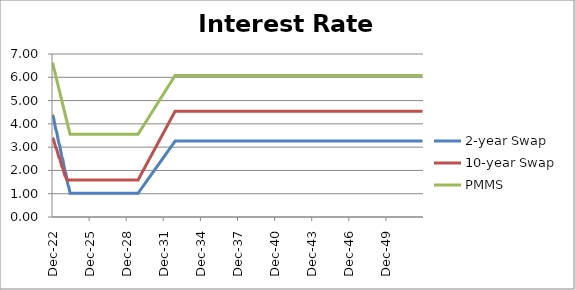
| Category | 2-year Swap | 10-year Swap | PMMS |
|---|---|---|---|
| 2022-12-30 | 4.388 | 3.404 | 6.629 |
| 2023-01-31 | 4.268 | 3.322 | 6.448 |
| 2023-02-28 | 4.027 | 3.16 | 6.267 |
| 2023-03-31 | 3.787 | 2.997 | 6.086 |
| 2023-04-30 | 3.667 | 2.916 | 5.905 |
| 2023-05-31 | 3.426 | 2.753 | 5.724 |
| 2023-06-30 | 3.186 | 2.59 | 5.543 |
| 2023-07-31 | 3.065 | 2.509 | 5.362 |
| 2023-08-31 | 2.825 | 2.346 | 5.181 |
| 2023-09-30 | 2.584 | 2.184 | 5.001 |
| 2023-10-31 | 2.464 | 2.102 | 4.82 |
| 2023-11-30 | 2.223 | 1.94 | 4.639 |
| 2023-12-31 | 1.983 | 1.777 | 4.458 |
| 2024-01-31 | 1.863 | 1.696 | 4.277 |
| 2024-02-29 | 1.622 | 1.589 | 4.096 |
| 2024-03-31 | 1.381 | 1.589 | 3.915 |
| 2024-04-30 | 1.261 | 1.589 | 3.734 |
| 2024-05-31 | 1.021 | 1.589 | 3.553 |
| 2024-06-30 | 1.021 | 1.589 | 3.553 |
| 2024-07-31 | 1.021 | 1.589 | 3.553 |
| 2024-08-31 | 1.021 | 1.589 | 3.553 |
| 2024-09-30 | 1.021 | 1.589 | 3.553 |
| 2024-10-31 | 1.021 | 1.589 | 3.553 |
| 2024-11-30 | 1.021 | 1.589 | 3.553 |
| 2024-12-31 | 1.021 | 1.589 | 3.553 |
| 2025-01-31 | 1.021 | 1.589 | 3.553 |
| 2025-02-28 | 1.021 | 1.589 | 3.553 |
| 2025-03-31 | 1.021 | 1.589 | 3.553 |
| 2025-04-30 | 1.021 | 1.589 | 3.553 |
| 2025-05-31 | 1.021 | 1.589 | 3.553 |
| 2025-06-30 | 1.021 | 1.589 | 3.553 |
| 2025-07-31 | 1.021 | 1.589 | 3.553 |
| 2025-08-31 | 1.021 | 1.589 | 3.553 |
| 2025-09-30 | 1.021 | 1.589 | 3.553 |
| 2025-10-31 | 1.021 | 1.589 | 3.553 |
| 2025-11-30 | 1.021 | 1.589 | 3.553 |
| 2025-12-31 | 1.021 | 1.589 | 3.553 |
| 2026-01-31 | 1.021 | 1.589 | 3.553 |
| 2026-02-28 | 1.021 | 1.589 | 3.553 |
| 2026-03-31 | 1.021 | 1.589 | 3.553 |
| 2026-04-30 | 1.021 | 1.589 | 3.553 |
| 2026-05-31 | 1.021 | 1.589 | 3.553 |
| 2026-06-30 | 1.021 | 1.589 | 3.553 |
| 2026-07-31 | 1.021 | 1.589 | 3.553 |
| 2026-08-31 | 1.021 | 1.589 | 3.553 |
| 2026-09-30 | 1.021 | 1.589 | 3.553 |
| 2026-10-31 | 1.021 | 1.589 | 3.553 |
| 2026-11-30 | 1.021 | 1.589 | 3.553 |
| 2026-12-31 | 1.021 | 1.589 | 3.553 |
| 2027-01-31 | 1.021 | 1.589 | 3.553 |
| 2027-02-28 | 1.021 | 1.589 | 3.553 |
| 2027-03-31 | 1.021 | 1.589 | 3.553 |
| 2027-04-30 | 1.021 | 1.589 | 3.553 |
| 2027-05-31 | 1.021 | 1.589 | 3.553 |
| 2027-06-30 | 1.021 | 1.589 | 3.553 |
| 2027-07-31 | 1.021 | 1.589 | 3.553 |
| 2027-08-31 | 1.021 | 1.589 | 3.553 |
| 2027-09-30 | 1.021 | 1.589 | 3.553 |
| 2027-10-31 | 1.021 | 1.589 | 3.553 |
| 2027-11-30 | 1.021 | 1.589 | 3.553 |
| 2027-12-31 | 1.021 | 1.589 | 3.553 |
| 2028-01-31 | 1.021 | 1.589 | 3.553 |
| 2028-02-29 | 1.021 | 1.589 | 3.553 |
| 2028-03-31 | 1.021 | 1.589 | 3.553 |
| 2028-04-30 | 1.021 | 1.589 | 3.553 |
| 2028-05-31 | 1.021 | 1.589 | 3.553 |
| 2028-06-30 | 1.021 | 1.589 | 3.553 |
| 2028-07-31 | 1.021 | 1.589 | 3.553 |
| 2028-08-31 | 1.021 | 1.589 | 3.553 |
| 2028-09-30 | 1.021 | 1.589 | 3.553 |
| 2028-10-31 | 1.021 | 1.589 | 3.553 |
| 2028-11-30 | 1.021 | 1.589 | 3.553 |
| 2028-12-31 | 1.021 | 1.589 | 3.553 |
| 2029-01-31 | 1.021 | 1.589 | 3.553 |
| 2029-02-28 | 1.021 | 1.589 | 3.553 |
| 2029-03-31 | 1.021 | 1.589 | 3.553 |
| 2029-04-30 | 1.021 | 1.589 | 3.553 |
| 2029-05-31 | 1.021 | 1.589 | 3.553 |
| 2029-06-30 | 1.021 | 1.589 | 3.553 |
| 2029-07-31 | 1.021 | 1.589 | 3.553 |
| 2029-08-31 | 1.021 | 1.589 | 3.553 |
| 2029-09-30 | 1.021 | 1.589 | 3.553 |
| 2029-10-31 | 1.021 | 1.589 | 3.553 |
| 2029-11-30 | 1.021 | 1.589 | 3.553 |
| 2029-12-31 | 1.083 | 1.671 | 3.623 |
| 2030-01-31 | 1.145 | 1.753 | 3.693 |
| 2030-02-28 | 1.207 | 1.835 | 3.763 |
| 2030-03-31 | 1.269 | 1.918 | 3.834 |
| 2030-04-30 | 1.332 | 2 | 3.904 |
| 2030-05-31 | 1.394 | 2.082 | 3.974 |
| 2030-06-30 | 1.456 | 2.164 | 4.044 |
| 2030-07-31 | 1.518 | 2.246 | 4.114 |
| 2030-08-31 | 1.58 | 2.328 | 4.185 |
| 2030-09-30 | 1.642 | 2.41 | 4.255 |
| 2030-10-31 | 1.705 | 2.493 | 4.325 |
| 2030-11-30 | 1.767 | 2.575 | 4.395 |
| 2030-12-31 | 1.829 | 2.657 | 4.465 |
| 2031-01-31 | 1.891 | 2.739 | 4.535 |
| 2031-02-28 | 1.953 | 2.821 | 4.606 |
| 2031-03-31 | 2.016 | 2.903 | 4.676 |
| 2031-04-30 | 2.078 | 2.985 | 4.746 |
| 2031-05-31 | 2.14 | 3.067 | 4.816 |
| 2031-06-30 | 2.202 | 3.15 | 4.886 |
| 2031-07-31 | 2.264 | 3.232 | 4.956 |
| 2031-08-31 | 2.327 | 3.314 | 5.027 |
| 2031-09-30 | 2.389 | 3.396 | 5.097 |
| 2031-10-31 | 2.451 | 3.478 | 5.167 |
| 2031-11-30 | 2.513 | 3.56 | 5.237 |
| 2031-12-31 | 2.575 | 3.642 | 5.307 |
| 2032-01-31 | 2.637 | 3.725 | 5.377 |
| 2032-02-29 | 2.7 | 3.807 | 5.448 |
| 2032-03-31 | 2.762 | 3.889 | 5.518 |
| 2032-04-30 | 2.824 | 3.971 | 5.588 |
| 2032-05-31 | 2.886 | 4.053 | 5.658 |
| 2032-06-30 | 2.948 | 4.135 | 5.728 |
| 2032-07-31 | 3.011 | 4.217 | 5.798 |
| 2032-08-31 | 3.073 | 4.3 | 5.869 |
| 2032-09-30 | 3.135 | 4.382 | 5.939 |
| 2032-10-31 | 3.197 | 4.464 | 6.009 |
| 2032-11-30 | 3.259 | 4.546 | 6.079 |
| 2032-12-31 | 3.259 | 4.546 | 6.079 |
| 2033-01-31 | 3.259 | 4.546 | 6.079 |
| 2033-02-28 | 3.259 | 4.546 | 6.079 |
| 2033-03-31 | 3.259 | 4.546 | 6.079 |
| 2033-04-30 | 3.259 | 4.546 | 6.079 |
| 2033-05-31 | 3.259 | 4.546 | 6.079 |
| 2033-06-30 | 3.259 | 4.546 | 6.079 |
| 2033-07-31 | 3.259 | 4.546 | 6.079 |
| 2033-08-31 | 3.259 | 4.546 | 6.079 |
| 2033-09-30 | 3.259 | 4.546 | 6.079 |
| 2033-10-31 | 3.259 | 4.546 | 6.079 |
| 2033-11-30 | 3.259 | 4.546 | 6.079 |
| 2033-12-31 | 3.259 | 4.546 | 6.079 |
| 2034-01-31 | 3.259 | 4.546 | 6.079 |
| 2034-02-28 | 3.259 | 4.546 | 6.079 |
| 2034-03-31 | 3.259 | 4.546 | 6.079 |
| 2034-04-30 | 3.259 | 4.546 | 6.079 |
| 2034-05-31 | 3.259 | 4.546 | 6.079 |
| 2034-06-30 | 3.259 | 4.546 | 6.079 |
| 2034-07-31 | 3.259 | 4.546 | 6.079 |
| 2034-08-31 | 3.259 | 4.546 | 6.079 |
| 2034-09-30 | 3.259 | 4.546 | 6.079 |
| 2034-10-31 | 3.259 | 4.546 | 6.079 |
| 2034-11-30 | 3.259 | 4.546 | 6.079 |
| 2034-12-31 | 3.259 | 4.546 | 6.079 |
| 2035-01-31 | 3.259 | 4.546 | 6.079 |
| 2035-02-28 | 3.259 | 4.546 | 6.079 |
| 2035-03-31 | 3.259 | 4.546 | 6.079 |
| 2035-04-30 | 3.259 | 4.546 | 6.079 |
| 2035-05-31 | 3.259 | 4.546 | 6.079 |
| 2035-06-30 | 3.259 | 4.546 | 6.079 |
| 2035-07-31 | 3.259 | 4.546 | 6.079 |
| 2035-08-31 | 3.259 | 4.546 | 6.079 |
| 2035-09-30 | 3.259 | 4.546 | 6.079 |
| 2035-10-31 | 3.259 | 4.546 | 6.079 |
| 2035-11-30 | 3.259 | 4.546 | 6.079 |
| 2035-12-31 | 3.259 | 4.546 | 6.079 |
| 2036-01-31 | 3.259 | 4.546 | 6.079 |
| 2036-02-29 | 3.259 | 4.546 | 6.079 |
| 2036-03-31 | 3.259 | 4.546 | 6.079 |
| 2036-04-30 | 3.259 | 4.546 | 6.079 |
| 2036-05-31 | 3.259 | 4.546 | 6.079 |
| 2036-06-30 | 3.259 | 4.546 | 6.079 |
| 2036-07-31 | 3.259 | 4.546 | 6.079 |
| 2036-08-31 | 3.259 | 4.546 | 6.079 |
| 2036-09-30 | 3.259 | 4.546 | 6.079 |
| 2036-10-31 | 3.259 | 4.546 | 6.079 |
| 2036-11-30 | 3.259 | 4.546 | 6.079 |
| 2036-12-31 | 3.259 | 4.546 | 6.079 |
| 2037-01-31 | 3.259 | 4.546 | 6.079 |
| 2037-02-28 | 3.259 | 4.546 | 6.079 |
| 2037-03-31 | 3.259 | 4.546 | 6.079 |
| 2037-04-30 | 3.259 | 4.546 | 6.079 |
| 2037-05-31 | 3.259 | 4.546 | 6.079 |
| 2037-06-30 | 3.259 | 4.546 | 6.079 |
| 2037-07-31 | 3.259 | 4.546 | 6.079 |
| 2037-08-31 | 3.259 | 4.546 | 6.079 |
| 2037-09-30 | 3.259 | 4.546 | 6.079 |
| 2037-10-31 | 3.259 | 4.546 | 6.079 |
| 2037-11-30 | 3.259 | 4.546 | 6.079 |
| 2037-12-31 | 3.259 | 4.546 | 6.079 |
| 2038-01-31 | 3.259 | 4.546 | 6.079 |
| 2038-02-28 | 3.259 | 4.546 | 6.079 |
| 2038-03-31 | 3.259 | 4.546 | 6.079 |
| 2038-04-30 | 3.259 | 4.546 | 6.079 |
| 2038-05-31 | 3.259 | 4.546 | 6.079 |
| 2038-06-30 | 3.259 | 4.546 | 6.079 |
| 2038-07-31 | 3.259 | 4.546 | 6.079 |
| 2038-08-31 | 3.259 | 4.546 | 6.079 |
| 2038-09-30 | 3.259 | 4.546 | 6.079 |
| 2038-10-31 | 3.259 | 4.546 | 6.079 |
| 2038-11-30 | 3.259 | 4.546 | 6.079 |
| 2038-12-31 | 3.259 | 4.546 | 6.079 |
| 2039-01-31 | 3.259 | 4.546 | 6.079 |
| 2039-02-28 | 3.259 | 4.546 | 6.079 |
| 2039-03-31 | 3.259 | 4.546 | 6.079 |
| 2039-04-30 | 3.259 | 4.546 | 6.079 |
| 2039-05-31 | 3.259 | 4.546 | 6.079 |
| 2039-06-30 | 3.259 | 4.546 | 6.079 |
| 2039-07-31 | 3.259 | 4.546 | 6.079 |
| 2039-08-31 | 3.259 | 4.546 | 6.079 |
| 2039-09-30 | 3.259 | 4.546 | 6.079 |
| 2039-10-31 | 3.259 | 4.546 | 6.079 |
| 2039-11-30 | 3.259 | 4.546 | 6.079 |
| 2039-12-31 | 3.259 | 4.546 | 6.079 |
| 2040-01-31 | 3.259 | 4.546 | 6.079 |
| 2040-02-29 | 3.259 | 4.546 | 6.079 |
| 2040-03-31 | 3.259 | 4.546 | 6.079 |
| 2040-04-30 | 3.259 | 4.546 | 6.079 |
| 2040-05-31 | 3.259 | 4.546 | 6.079 |
| 2040-06-30 | 3.259 | 4.546 | 6.079 |
| 2040-07-31 | 3.259 | 4.546 | 6.079 |
| 2040-08-31 | 3.259 | 4.546 | 6.079 |
| 2040-09-30 | 3.259 | 4.546 | 6.079 |
| 2040-10-31 | 3.259 | 4.546 | 6.079 |
| 2040-11-30 | 3.259 | 4.546 | 6.079 |
| 2040-12-31 | 3.259 | 4.546 | 6.079 |
| 2041-01-31 | 3.259 | 4.546 | 6.079 |
| 2041-02-28 | 3.259 | 4.546 | 6.079 |
| 2041-03-31 | 3.259 | 4.546 | 6.079 |
| 2041-04-30 | 3.259 | 4.546 | 6.079 |
| 2041-05-31 | 3.259 | 4.546 | 6.079 |
| 2041-06-30 | 3.259 | 4.546 | 6.079 |
| 2041-07-31 | 3.259 | 4.546 | 6.079 |
| 2041-08-31 | 3.259 | 4.546 | 6.079 |
| 2041-09-30 | 3.259 | 4.546 | 6.079 |
| 2041-10-31 | 3.259 | 4.546 | 6.079 |
| 2041-11-30 | 3.259 | 4.546 | 6.079 |
| 2041-12-31 | 3.259 | 4.546 | 6.079 |
| 2042-01-31 | 3.259 | 4.546 | 6.079 |
| 2042-02-28 | 3.259 | 4.546 | 6.079 |
| 2042-03-31 | 3.259 | 4.546 | 6.079 |
| 2042-04-30 | 3.259 | 4.546 | 6.079 |
| 2042-05-31 | 3.259 | 4.546 | 6.079 |
| 2042-06-30 | 3.259 | 4.546 | 6.079 |
| 2042-07-31 | 3.259 | 4.546 | 6.079 |
| 2042-08-31 | 3.259 | 4.546 | 6.079 |
| 2042-09-30 | 3.259 | 4.546 | 6.079 |
| 2042-10-31 | 3.259 | 4.546 | 6.079 |
| 2042-11-30 | 3.259 | 4.546 | 6.079 |
| 2042-12-31 | 3.259 | 4.546 | 6.079 |
| 2043-01-31 | 3.259 | 4.546 | 6.079 |
| 2043-02-28 | 3.259 | 4.546 | 6.079 |
| 2043-03-31 | 3.259 | 4.546 | 6.079 |
| 2043-04-30 | 3.259 | 4.546 | 6.079 |
| 2043-05-31 | 3.259 | 4.546 | 6.079 |
| 2043-06-30 | 3.259 | 4.546 | 6.079 |
| 2043-07-31 | 3.259 | 4.546 | 6.079 |
| 2043-08-31 | 3.259 | 4.546 | 6.079 |
| 2043-09-30 | 3.259 | 4.546 | 6.079 |
| 2043-10-31 | 3.259 | 4.546 | 6.079 |
| 2043-11-30 | 3.259 | 4.546 | 6.079 |
| 2043-12-31 | 3.259 | 4.546 | 6.079 |
| 2044-01-31 | 3.259 | 4.546 | 6.079 |
| 2044-02-29 | 3.259 | 4.546 | 6.079 |
| 2044-03-31 | 3.259 | 4.546 | 6.079 |
| 2044-04-30 | 3.259 | 4.546 | 6.079 |
| 2044-05-31 | 3.259 | 4.546 | 6.079 |
| 2044-06-30 | 3.259 | 4.546 | 6.079 |
| 2044-07-31 | 3.259 | 4.546 | 6.079 |
| 2044-08-31 | 3.259 | 4.546 | 6.079 |
| 2044-09-30 | 3.259 | 4.546 | 6.079 |
| 2044-10-31 | 3.259 | 4.546 | 6.079 |
| 2044-11-30 | 3.259 | 4.546 | 6.079 |
| 2044-12-31 | 3.259 | 4.546 | 6.079 |
| 2045-01-31 | 3.259 | 4.546 | 6.079 |
| 2045-02-28 | 3.259 | 4.546 | 6.079 |
| 2045-03-31 | 3.259 | 4.546 | 6.079 |
| 2045-04-30 | 3.259 | 4.546 | 6.079 |
| 2045-05-31 | 3.259 | 4.546 | 6.079 |
| 2045-06-30 | 3.259 | 4.546 | 6.079 |
| 2045-07-31 | 3.259 | 4.546 | 6.079 |
| 2045-08-31 | 3.259 | 4.546 | 6.079 |
| 2045-09-30 | 3.259 | 4.546 | 6.079 |
| 2045-10-31 | 3.259 | 4.546 | 6.079 |
| 2045-11-30 | 3.259 | 4.546 | 6.079 |
| 2045-12-31 | 3.259 | 4.546 | 6.079 |
| 2046-01-31 | 3.259 | 4.546 | 6.079 |
| 2046-02-28 | 3.259 | 4.546 | 6.079 |
| 2046-03-31 | 3.259 | 4.546 | 6.079 |
| 2046-04-30 | 3.259 | 4.546 | 6.079 |
| 2046-05-31 | 3.259 | 4.546 | 6.079 |
| 2046-06-30 | 3.259 | 4.546 | 6.079 |
| 2046-07-31 | 3.259 | 4.546 | 6.079 |
| 2046-08-31 | 3.259 | 4.546 | 6.079 |
| 2046-09-30 | 3.259 | 4.546 | 6.079 |
| 2046-10-31 | 3.259 | 4.546 | 6.079 |
| 2046-11-30 | 3.259 | 4.546 | 6.079 |
| 2046-12-31 | 3.259 | 4.546 | 6.079 |
| 2047-01-31 | 3.259 | 4.546 | 6.079 |
| 2047-02-28 | 3.259 | 4.546 | 6.079 |
| 2047-03-31 | 3.259 | 4.546 | 6.079 |
| 2047-04-30 | 3.259 | 4.546 | 6.079 |
| 2047-05-31 | 3.259 | 4.546 | 6.079 |
| 2047-06-30 | 3.259 | 4.546 | 6.079 |
| 2047-07-31 | 3.259 | 4.546 | 6.079 |
| 2047-08-31 | 3.259 | 4.546 | 6.079 |
| 2047-09-30 | 3.259 | 4.546 | 6.079 |
| 2047-10-31 | 3.259 | 4.546 | 6.079 |
| 2047-11-30 | 3.259 | 4.546 | 6.079 |
| 2047-12-31 | 3.259 | 4.546 | 6.079 |
| 2048-01-31 | 3.259 | 4.546 | 6.079 |
| 2048-02-29 | 3.259 | 4.546 | 6.079 |
| 2048-03-31 | 3.259 | 4.546 | 6.079 |
| 2048-04-30 | 3.259 | 4.546 | 6.079 |
| 2048-05-31 | 3.259 | 4.546 | 6.079 |
| 2048-06-30 | 3.259 | 4.546 | 6.079 |
| 2048-07-31 | 3.259 | 4.546 | 6.079 |
| 2048-08-31 | 3.259 | 4.546 | 6.079 |
| 2048-09-30 | 3.259 | 4.546 | 6.079 |
| 2048-10-31 | 3.259 | 4.546 | 6.079 |
| 2048-11-30 | 3.259 | 4.546 | 6.079 |
| 2048-12-31 | 3.259 | 4.546 | 6.079 |
| 2049-01-31 | 3.259 | 4.546 | 6.079 |
| 2049-02-28 | 3.259 | 4.546 | 6.079 |
| 2049-03-31 | 3.259 | 4.546 | 6.079 |
| 2049-04-30 | 3.259 | 4.546 | 6.079 |
| 2049-05-31 | 3.259 | 4.546 | 6.079 |
| 2049-06-30 | 3.259 | 4.546 | 6.079 |
| 2049-07-31 | 3.259 | 4.546 | 6.079 |
| 2049-08-31 | 3.259 | 4.546 | 6.079 |
| 2049-09-30 | 3.259 | 4.546 | 6.079 |
| 2049-10-31 | 3.259 | 4.546 | 6.079 |
| 2049-11-30 | 3.259 | 4.546 | 6.079 |
| 2049-12-31 | 3.259 | 4.546 | 6.079 |
| 2050-01-31 | 3.259 | 4.546 | 6.079 |
| 2050-02-28 | 3.259 | 4.546 | 6.079 |
| 2050-03-31 | 3.259 | 4.546 | 6.079 |
| 2050-04-30 | 3.259 | 4.546 | 6.079 |
| 2050-05-31 | 3.259 | 4.546 | 6.079 |
| 2050-06-30 | 3.259 | 4.546 | 6.079 |
| 2050-07-31 | 3.259 | 4.546 | 6.079 |
| 2050-08-31 | 3.259 | 4.546 | 6.079 |
| 2050-09-30 | 3.259 | 4.546 | 6.079 |
| 2050-10-31 | 3.259 | 4.546 | 6.079 |
| 2050-11-30 | 3.259 | 4.546 | 6.079 |
| 2050-12-31 | 3.259 | 4.546 | 6.079 |
| 2051-01-31 | 3.259 | 4.546 | 6.079 |
| 2051-02-28 | 3.259 | 4.546 | 6.079 |
| 2051-03-31 | 3.259 | 4.546 | 6.079 |
| 2051-04-30 | 3.259 | 4.546 | 6.079 |
| 2051-05-31 | 3.259 | 4.546 | 6.079 |
| 2051-06-30 | 3.259 | 4.546 | 6.079 |
| 2051-07-31 | 3.259 | 4.546 | 6.079 |
| 2051-08-31 | 3.259 | 4.546 | 6.079 |
| 2051-09-30 | 3.259 | 4.546 | 6.079 |
| 2051-10-31 | 3.259 | 4.546 | 6.079 |
| 2051-11-30 | 3.259 | 4.546 | 6.079 |
| 2051-12-31 | 3.259 | 4.546 | 6.079 |
| 2052-01-31 | 3.259 | 4.546 | 6.079 |
| 2052-02-29 | 3.259 | 4.546 | 6.079 |
| 2052-03-31 | 3.259 | 4.546 | 6.079 |
| 2052-04-30 | 3.259 | 4.546 | 6.079 |
| 2052-05-31 | 3.259 | 4.546 | 6.079 |
| 2052-06-30 | 3.259 | 4.546 | 6.079 |
| 2052-07-31 | 3.259 | 4.546 | 6.079 |
| 2052-08-31 | 3.259 | 4.546 | 6.079 |
| 2052-09-30 | 3.259 | 4.546 | 6.079 |
| 2052-10-31 | 3.259 | 4.546 | 6.079 |
| 2052-11-30 | 3.259 | 4.546 | 6.079 |